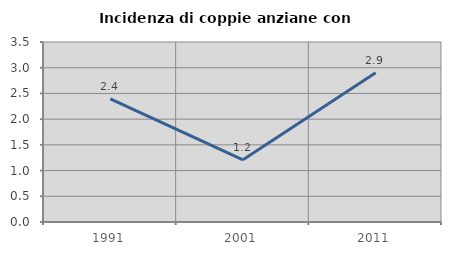
| Category | Incidenza di coppie anziane con figli |
|---|---|
| 1991.0 | 2.392 |
| 2001.0 | 1.21 |
| 2011.0 | 2.903 |